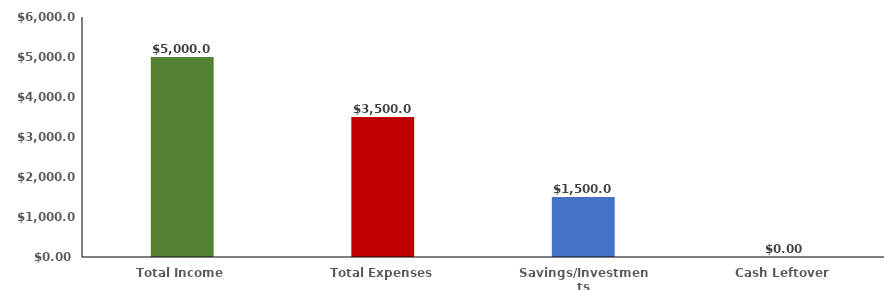
| Category | Series 0 |
|---|---|
| Total Income | 5000 |
| Total Expenses | 3500 |
| Savings/Investments | 1500 |
| Cash Leftover | 0 |